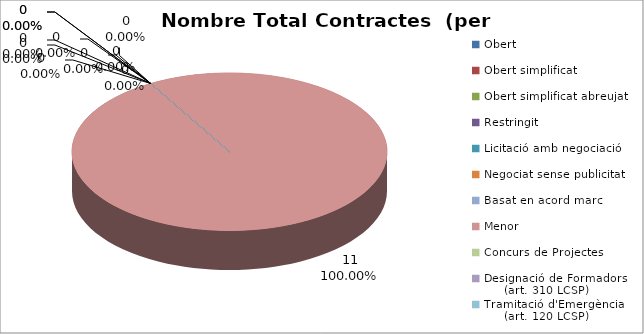
| Category | Nombre Total Contractes |
|---|---|
| Obert | 0 |
| Obert simplificat | 0 |
| Obert simplificat abreujat | 0 |
| Restringit | 0 |
| Licitació amb negociació | 0 |
| Negociat sense publicitat | 0 |
| Basat en acord marc | 0 |
| Menor | 11 |
| Concurs de Projectes | 0 |
| Designació de Formadors
     (art. 310 LCSP) | 0 |
| Tramitació d'Emergència
     (art. 120 LCSP) | 0 |